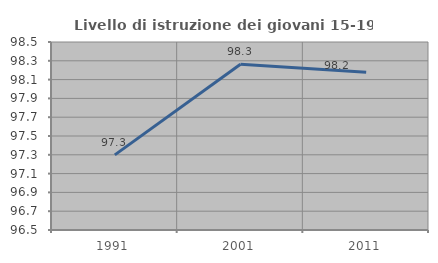
| Category | Livello di istruzione dei giovani 15-19 anni |
|---|---|
| 1991.0 | 97.299 |
| 2001.0 | 98.263 |
| 2011.0 | 98.179 |